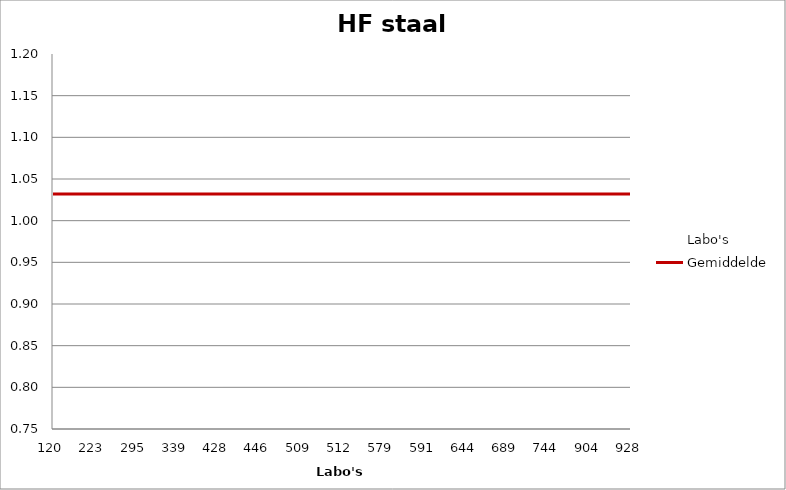
| Category | Labo's | Gemiddelde |
|---|---|---|
| 120.0 | 0.79 | 1.032 |
| 223.0 | 1.1 | 1.032 |
| 295.0 | 0.99 | 1.032 |
| 339.0 | 0.99 | 1.032 |
| 428.0 | 1.2 | 1.032 |
| 446.0 | 1.1 | 1.032 |
| 509.0 | 1.03 | 1.032 |
| 512.0 | 0.79 | 1.032 |
| 579.0 | 0.95 | 1.032 |
| 591.0 | 1.2 | 1.032 |
| 644.0 | 1.04 | 1.032 |
| 689.0 | 1.07 | 1.032 |
| 744.0 | 0.99 | 1.032 |
| 904.0 | 1.26 | 1.032 |
| 928.0 | 0.96 | 1.032 |